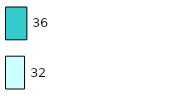
| Category | Series 0 | Series 1 |
|---|---|---|
| 0 | 32 | 36 |